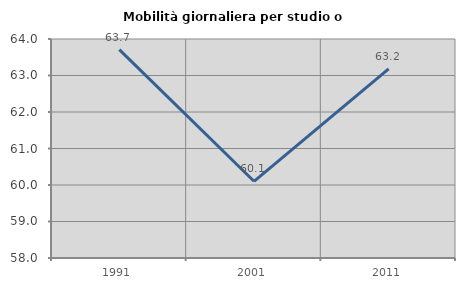
| Category | Mobilità giornaliera per studio o lavoro |
|---|---|
| 1991.0 | 63.708 |
| 2001.0 | 60.102 |
| 2011.0 | 63.182 |